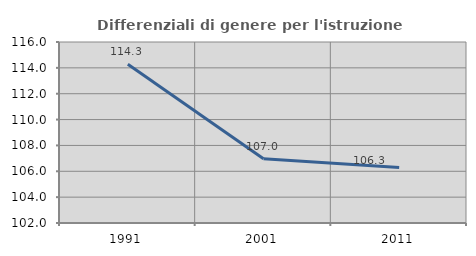
| Category | Differenziali di genere per l'istruzione superiore |
|---|---|
| 1991.0 | 114.283 |
| 2001.0 | 106.964 |
| 2011.0 | 106.284 |